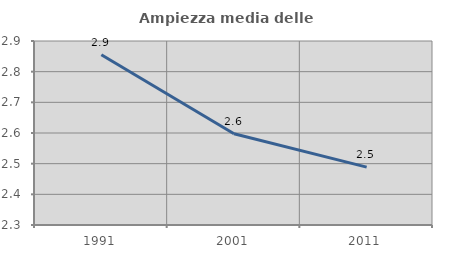
| Category | Ampiezza media delle famiglie |
|---|---|
| 1991.0 | 2.855 |
| 2001.0 | 2.598 |
| 2011.0 | 2.489 |